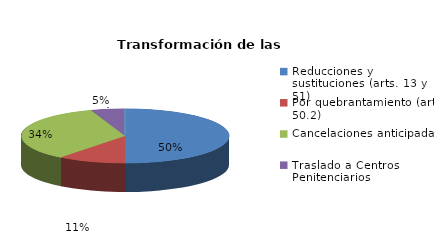
| Category | Series 0 |
|---|---|
| Reducciones y sustituciones (arts. 13 y 51) | 19 |
| Por quebrantamiento (art. 50.2) | 4 |
| Cancelaciones anticipadas | 13 |
| Traslado a Centros Penitenciarios | 2 |
| Conversión internamientos en cerrados (art. 51.2) | 0 |